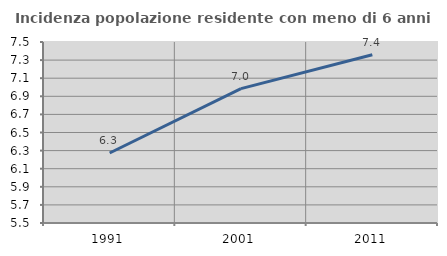
| Category | Incidenza popolazione residente con meno di 6 anni |
|---|---|
| 1991.0 | 6.273 |
| 2001.0 | 6.984 |
| 2011.0 | 7.359 |